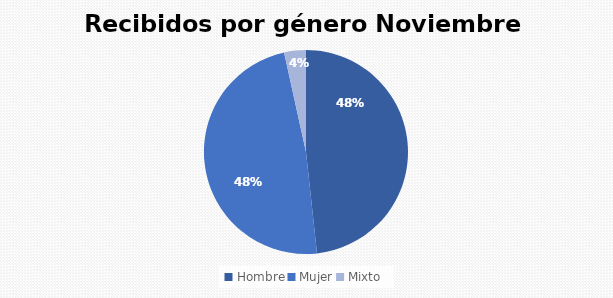
| Category | Recibidos por género  NOVIEMBRE |
|---|---|
| Hombre | 14 |
| Mujer | 14 |
| Mixto | 1 |